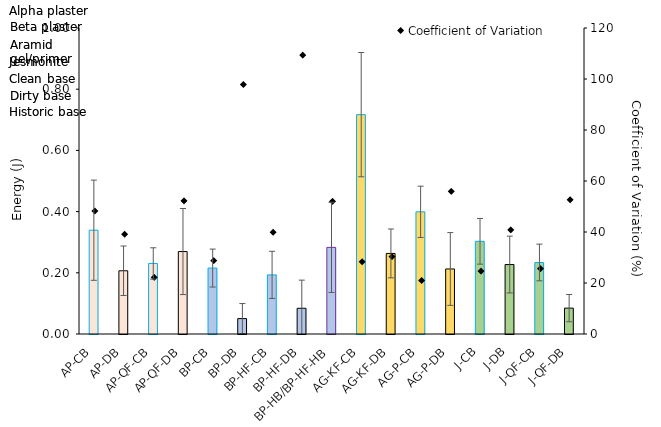
| Category | Mean |
|---|---|
| AP-CB | 0.339 |
| AP-DB | 0.207 |
| AP-QF-CB | 0.23 |
| AP-QF-DB | 0.27 |
| BP-CB | 0.215 |
| BP-DB | 0.05 |
| BP-HF-CB | 0.193 |
| BP-HF-DB | 0.084 |
| BP-HB/BP-HF-HB | 0.283 |
| AG-KF-CB | 0.717 |
| AG-KF-DB | 0.263 |
| AG-P-CB | 0.399 |
| AG-P-DB | 0.212 |
| J-CB | 0.303 |
| J-DB | 0.227 |
| J-QF-CB | 0.234 |
| J-QF-DB | 0.085 |